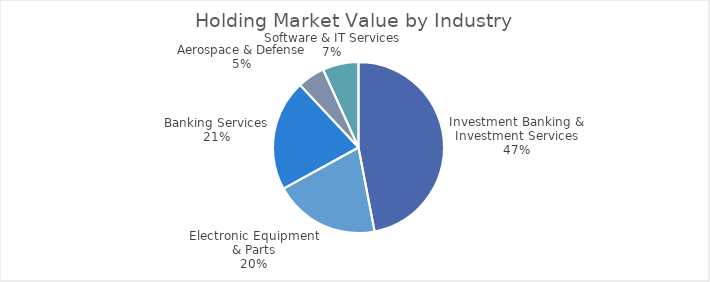
| Category | Market Value |
|---|---|
| Investment Banking & Investment Services | 14727.42 |
| Electronic Equipment & Parts | 6284.25 |
| Banking Services | 6586.09 |
| Aerospace & Defense | 1626.3 |
| Software & IT Services | 2125.92 |